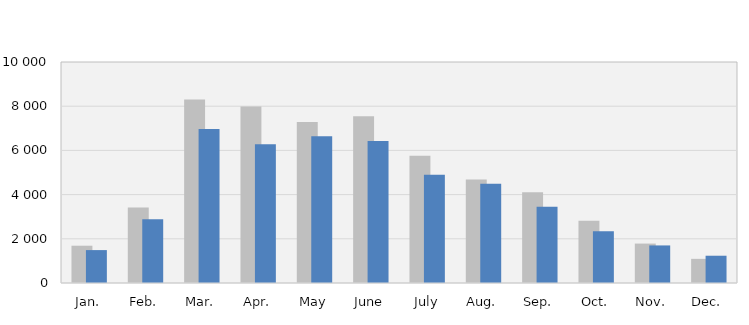
| Category | 2021 | 2022 |
|---|---|---|
| Jan. | 1687 | 1489 |
| Feb. | 3421 | 2884 |
| Mar. | 8299 | 6971 |
| Apr. | 7990 | 6275 |
| May | 7284 | 6642 |
| June | 7541 | 6425 |
| July | 5759 | 4902 |
| Aug. | 4683 | 4492 |
| Sep. | 4110 | 3448 |
| Oct. | 2817 | 2337 |
| Nov. | 1784 | 1700 |
| Dec. | 1093 | 1234 |